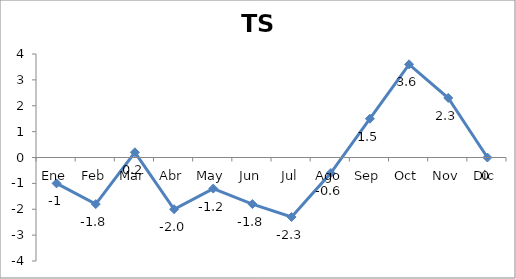
| Category | TS |
|---|---|
| Ene | -1 |
| Feb | -1.8 |
| Mar | 0.2 |
| Abr | -2 |
| May | -1.2 |
| Jun | -1.8 |
| Jul | -2.3 |
| Ago | -0.6 |
| Sep | 1.5 |
| Oct | 3.6 |
| Nov | 2.3 |
| Dic | 0 |